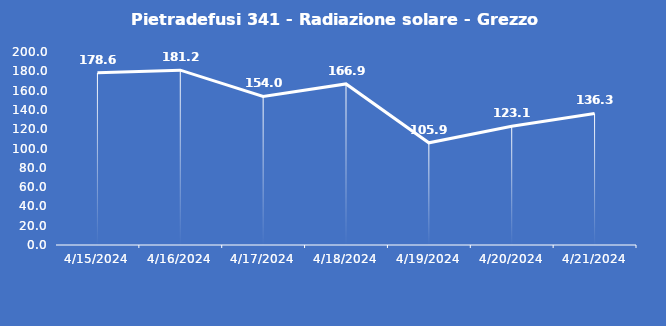
| Category | Pietradefusi 341 - Radiazione solare - Grezzo (W/m2) |
|---|---|
| 4/15/24 | 178.6 |
| 4/16/24 | 181.2 |
| 4/17/24 | 154 |
| 4/18/24 | 166.9 |
| 4/19/24 | 105.9 |
| 4/20/24 | 123.1 |
| 4/21/24 | 136.3 |